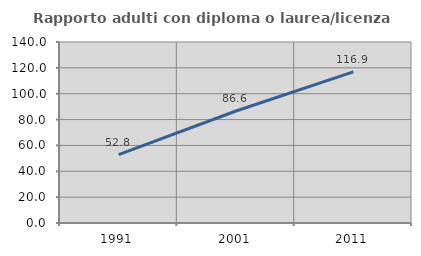
| Category | Rapporto adulti con diploma o laurea/licenza media  |
|---|---|
| 1991.0 | 52.817 |
| 2001.0 | 86.611 |
| 2011.0 | 116.855 |